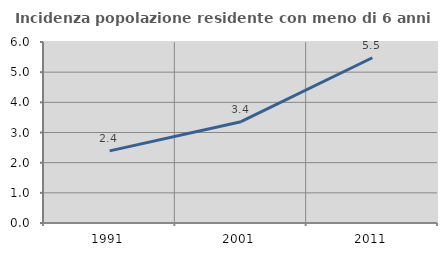
| Category | Incidenza popolazione residente con meno di 6 anni |
|---|---|
| 1991.0 | 2.39 |
| 2001.0 | 3.358 |
| 2011.0 | 5.478 |